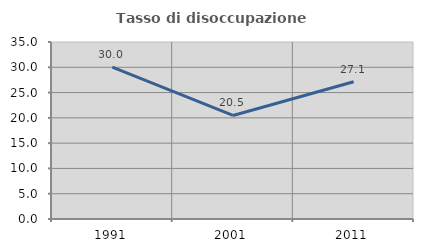
| Category | Tasso di disoccupazione giovanile  |
|---|---|
| 1991.0 | 30.043 |
| 2001.0 | 20.472 |
| 2011.0 | 27.143 |